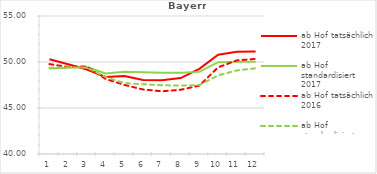
| Category | ab Hof tatsächlich 2017 | ab Hof standardisiert 2017 | ab Hof tatsächlich 2016 | ab Hof standardisiert 2016 |
|---|---|---|---|---|
| 0 | 50.301 | 49.307 | 49.773 | 49.35 |
| 1 | 49.764 | 49.384 | 49.457 | 49.426 |
| 2 | 49.177 | 49.449 | 49.517 | 49.393 |
| 3 | 48.372 | 48.75 | 48.153 | 48.355 |
| 4 | 48.489 | 48.933 | 47.512 | 47.703 |
| 5 | 48.056 | 48.878 | 47.009 | 47.582 |
| 6 | 48.009 | 48.836 | 46.814 | 47.475 |
| 7 | 48.253 | 48.842 | 46.981 | 47.433 |
| 8 | 49.258 | 48.926 | 47.433 | 47.502 |
| 9 | 50.782 | 49.976 | 49.42 | 48.543 |
| 10 | 51.124 | 50.014 | 50.175 | 49.084 |
| 11 | 51.149 | 50.038 | 50.337 | 49.318 |